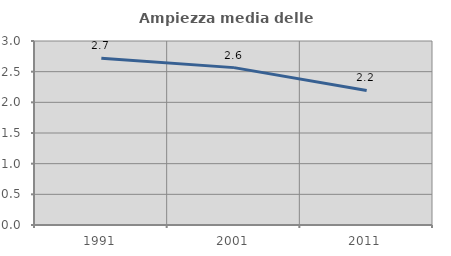
| Category | Ampiezza media delle famiglie |
|---|---|
| 1991.0 | 2.717 |
| 2001.0 | 2.566 |
| 2011.0 | 2.194 |